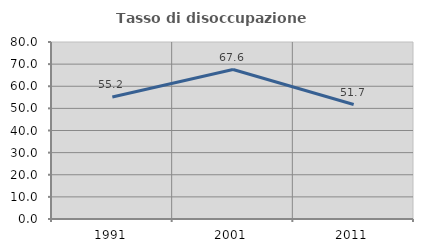
| Category | Tasso di disoccupazione giovanile  |
|---|---|
| 1991.0 | 55.172 |
| 2001.0 | 67.568 |
| 2011.0 | 51.724 |